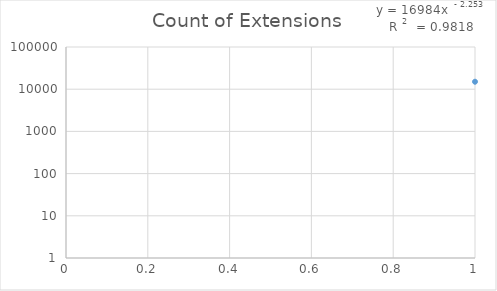
| Category | Count of Extensions |
|---|---|
| 0 | 15033 |
| 1 | 1421 |
| 2 | 1017 |
| 3 | 663 |
| 4 | 573 |
| 5 | 534 |
| 6 | 331 |
| 7 | 123 |
| 8 | 117 |
| 9 | 115 |
| 10 | 110 |
| 11 | 106 |
| 12 | 87 |
| 13 | 61 |
| 14 | 61 |
| 15 | 38 |
| 16 | 33 |
| 17 | 30 |
| 18 | 30 |
| 19 | 25 |
| 20 | 22 |
| 21 | 15 |
| 22 | 12 |
| 23 | 12 |
| 24 | 12 |
| 25 | 11 |
| 26 | 8 |
| 27 | 7 |
| 28 | 7 |
| 29 | 7 |
| 30 | 7 |
| 31 | 7 |
| 32 | 6 |
| 33 | 6 |
| 34 | 6 |
| 35 | 6 |
| 36 | 5 |
| 37 | 5 |
| 38 | 5 |
| 39 | 4 |
| 40 | 4 |
| 41 | 4 |
| 42 | 4 |
| 43 | 3 |
| 44 | 3 |
| 45 | 3 |
| 46 | 3 |
| 47 | 3 |
| 48 | 2 |
| 49 | 2 |
| 50 | 2 |
| 51 | 2 |
| 52 | 2 |
| 53 | 2 |
| 54 | 2 |
| 55 | 2 |
| 56 | 1 |
| 57 | 1 |
| 58 | 1 |
| 59 | 1 |
| 60 | 1 |
| 61 | 1 |
| 62 | 1 |
| 63 | 1 |
| 64 | 1 |
| 65 | 1 |
| 66 | 1 |
| 67 | 1 |
| 68 | 1 |
| 69 | 1 |
| 70 | 1 |
| 71 | 1 |
| 72 | 1 |
| 73 | 1 |
| 74 | 1 |
| 75 | 1 |
| 76 | 1 |
| 77 | 1 |
| 78 | 1 |
| 79 | 1 |
| 80 | 1 |
| 81 | 1 |
| 82 | 1 |
| 83 | 1 |
| 84 | 1 |
| 85 | 1 |
| 86 | 1 |
| 87 | 1 |
| 88 | 1 |
| 89 | 1 |
| 90 | 1 |
| 91 | 1 |
| 92 | 1 |